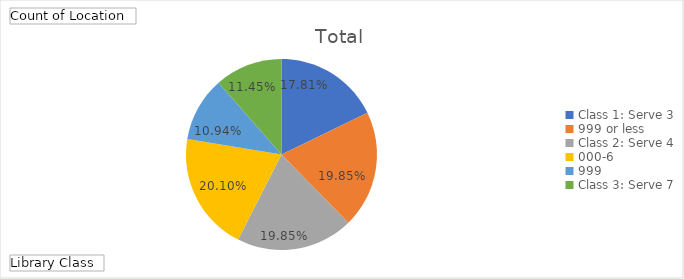
| Category | Total |
|---|---|
| Class 1: Serve 3,999 or less | 0.178 |
| Class 2: Serve 4,000-6,999 | 0.198 |
| Class 3: Serve 7,000-11,999 | 0.198 |
| Class 4: Serve 12,000-25,999 | 0.201 |
| Class 5: Serve 26,000-49,999 | 0.109 |
| Class 6: Serve 50,000+ | 0.115 |